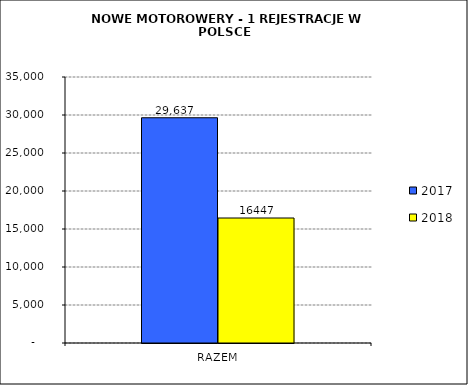
| Category | 2017 | 2018 |
|---|---|---|
| RAZEM | 29637 | 16447 |